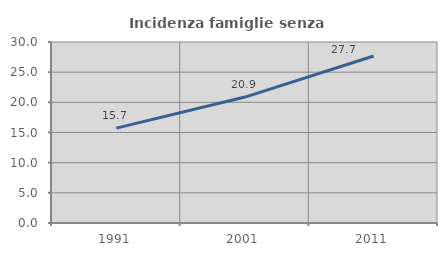
| Category | Incidenza famiglie senza nuclei |
|---|---|
| 1991.0 | 15.726 |
| 2001.0 | 20.87 |
| 2011.0 | 27.672 |